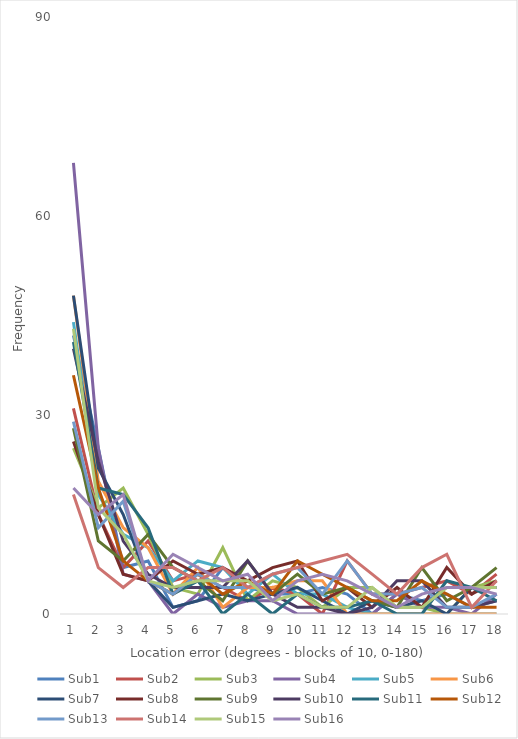
| Category | Sub1 | Sub2 | Sub3 | Sub4 | Sub5 | Sub6 | Sub7 | Sub8 | Sub9 | Sub10 | Sub11 | Sub12 | Sub13 | Sub14 | Sub15 | Sub16 |
|---|---|---|---|---|---|---|---|---|---|---|---|---|---|---|---|---|
| 0 | 42 | 31 | 25 | 68 | 44 | 48 | 48 | 26 | 28 | 40 | 41 | 36 | 29 | 18 | 43 | 19 |
| 1 | 25 | 15 | 16 | 25 | 18 | 20 | 22 | 15 | 11 | 23 | 19 | 19 | 13 | 7 | 16 | 15 |
| 2 | 7 | 7 | 19 | 6 | 12 | 13 | 15 | 6 | 8 | 11 | 18 | 8 | 17 | 4 | 12 | 18 |
| 3 | 8 | 11 | 12 | 5 | 10 | 10 | 5 | 5 | 12 | 6 | 13 | 5 | 5 | 7 | 5 | 5 |
| 4 | 1 | 5 | 4 | 0 | 5 | 3 | 1 | 8 | 7 | 4 | 3 | 3 | 3 | 7 | 4 | 9 |
| 5 | 2 | 6 | 3 | 3 | 8 | 7 | 2 | 6 | 5 | 4 | 5 | 6 | 6 | 5 | 5 | 7 |
| 6 | 7 | 4 | 10 | 1 | 7 | 1 | 3 | 7 | 2 | 4 | 0 | 3 | 4 | 7 | 5 | 5 |
| 7 | 4 | 2 | 2 | 2 | 3 | 4 | 2 | 5 | 8 | 8 | 3 | 5 | 4 | 4 | 5 | 6 |
| 8 | 3 | 4 | 5 | 2 | 6 | 4 | 3 | 7 | 3 | 3 | 0 | 3 | 6 | 6 | 2 | 2 |
| 9 | 3 | 3 | 4 | 0 | 3 | 5 | 4 | 8 | 6 | 1 | 3 | 8 | 7 | 7 | 3 | 5 |
| 10 | 4 | 0 | 1 | 0 | 3 | 5 | 2 | 2 | 3 | 1 | 1 | 6 | 3 | 8 | 1 | 6 |
| 11 | 3 | 8 | 4 | 0 | 1 | 0 | 0 | 4 | 4 | 0 | 1 | 4 | 8 | 9 | 1 | 5 |
| 12 | 0 | 3 | 4 | 0 | 0 | 0 | 2 | 1 | 2 | 1 | 2 | 2 | 3 | 6 | 4 | 3 |
| 13 | 3 | 3 | 1 | 3 | 0 | 0 | 1 | 4 | 1 | 5 | 0 | 2 | 3 | 3 | 1 | 1 |
| 14 | 2 | 4 | 1 | 1 | 0 | 0 | 2 | 1 | 7 | 5 | 0 | 5 | 4 | 7 | 1 | 3 |
| 15 | 3 | 5 | 0 | 1 | 0 | 0 | 0 | 7 | 2 | 1 | 5 | 3 | 1 | 9 | 4 | 4 |
| 16 | 1 | 3 | 4 | 0 | 0 | 0 | 4 | 3 | 4 | 1 | 4 | 1 | 1 | 1 | 4 | 4 |
| 17 | 2 | 6 | 5 | 3 | 0 | 0 | 4 | 5 | 7 | 2 | 2 | 1 | 3 | 5 | 4 | 3 |